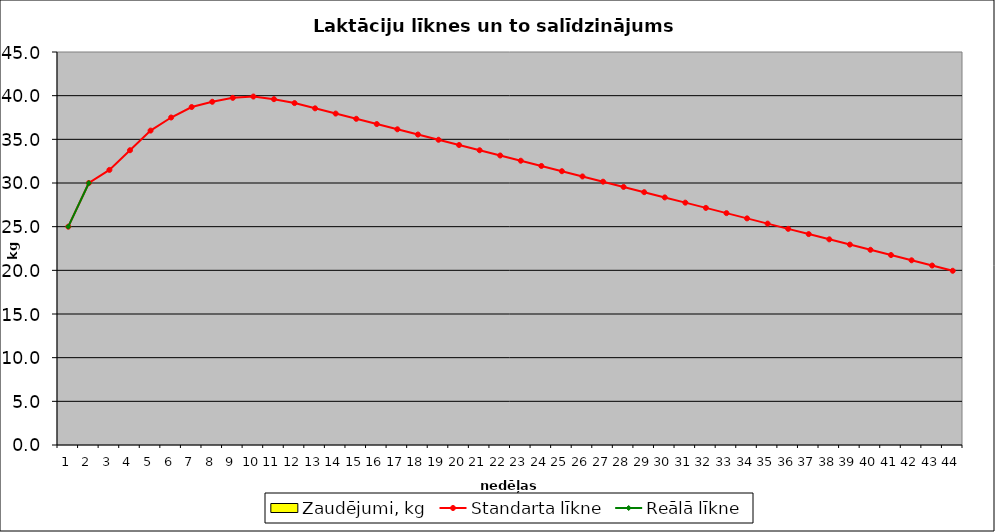
| Category | Zaudējumi, kg |
|---|---|
| 0 | 0 |
| 1 | 0 |
| 2 | 0 |
| 3 | 0 |
| 4 | 0 |
| 5 | 0 |
| 6 | 0 |
| 7 | 0 |
| 8 | 0 |
| 9 | 0 |
| 10 | 0 |
| 11 | 0 |
| 12 | 0 |
| 13 | 0 |
| 14 | 0 |
| 15 | 0 |
| 16 | 0 |
| 17 | 0 |
| 18 | 0 |
| 19 | 0 |
| 20 | 0 |
| 21 | 0 |
| 22 | 0 |
| 23 | 0 |
| 24 | 0 |
| 25 | 0 |
| 26 | 0 |
| 27 | 0 |
| 28 | 0 |
| 29 | 0 |
| 30 | 0 |
| 31 | 0 |
| 32 | 0 |
| 33 | 0 |
| 34 | 0 |
| 35 | 0 |
| 36 | 0 |
| 37 | 0 |
| 38 | 0 |
| 39 | 0 |
| 40 | 0 |
| 41 | 0 |
| 42 | 0 |
| 43 | 0 |